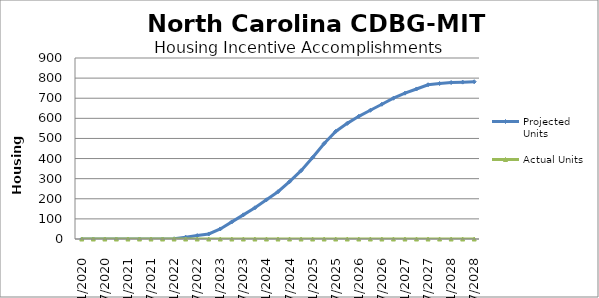
| Category | Projected Units | Actual Units |
|---|---|---|
| 01/2020 | 0 | 0 |
| 04/2020 | 0 | 0 |
| 07/2020 | 0 | 0 |
| 10/2020 | 0 | 0 |
| 01/2021 | 0 | 0 |
| 04/2021 | 0 | 0 |
| 07/2021 | 0 | 0 |
| 10/2021 | 0 | 0 |
| 01/2022 | 1 | 0 |
| 04/2022 | 9 | 0 |
| 07/2022 | 17 | 0 |
| 10/2022 | 25 | 0 |
| 01/2023 | 50 | 0 |
| 04/2023 | 85 | 0 |
| 07/2023 | 120 | 0 |
| 10/2023 | 155 | 0 |
| 01/2024 | 195 | 0 |
| 04/2024 | 235 | 0 |
| 07/2024 | 285 | 0 |
| 10/2024 | 340 | 0 |
| 01/2025 | 405 | 0 |
| 04/2025 | 475 | 0 |
| 07/2025 | 535 | 0 |
| 10/2025 | 575 | 0 |
| 01/2026 | 610 | 0 |
| 04/2026 | 640 | 0 |
| 07/2026 | 670 | 0 |
| 10/2026 | 700 | 0 |
| 01/2027 | 725 | 0 |
| 04/2027 | 746 | 0 |
| 07/2027 | 767 | 0 |
| 10/2027 | 773 | 0 |
| 01/2028 | 778 | 0 |
| 04/2028 | 780 | 0 |
| 07/2028 | 782 | 0 |